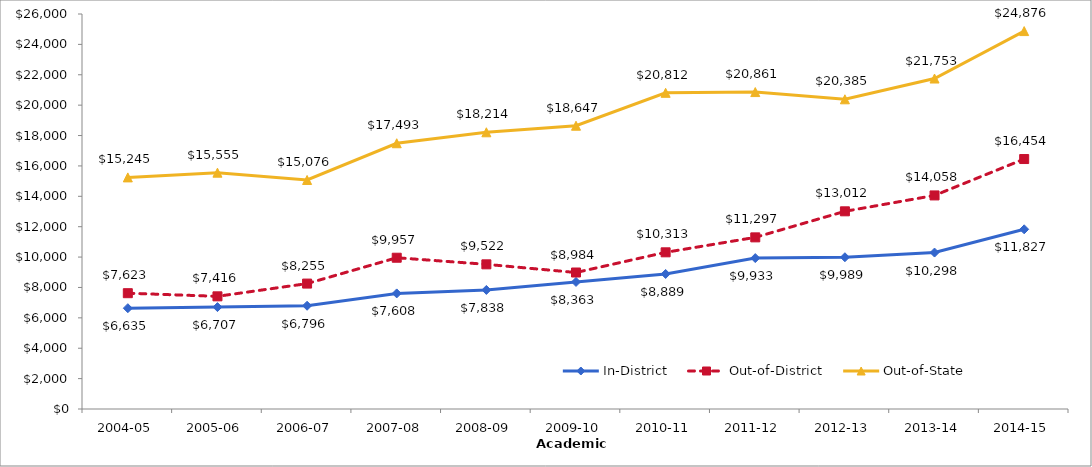
| Category | In-District | Out-of-District | Out-of-State |
|---|---|---|---|
| 2004-05 | 6635 | 7623 | 15245 |
| 2005-06 | 6707 | 7416 | 15555 |
| 2006-07 | 6796 | 8255 | 15076 |
| 2007-08 | 7608 | 9957 | 17493 |
| 2008-09 | 7838.053 | 9522.053 | 18213.684 |
| 2009-10 | 8363 | 8984 | 18647 |
| 2010-11 | 8889 | 10313 | 20812 |
| 2011-12 | 9933.23 | 11297.18 | 20861.23 |
| 2012-13 | 9988.67 | 13011.78 | 20384.67 |
| 2013-14 | 10297.84 | 14057.56 | 21753.28 |
| 2014-15 | 11827.062 | 16453.562 | 24875.688 |